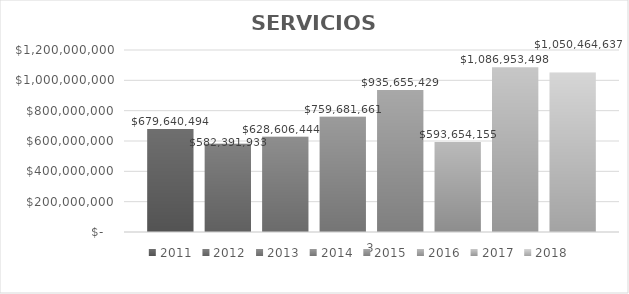
| Category | 2011 | 2012 | 2013 | 2014 | 2015 | 2016 | 2017 | 2018 |
|---|---|---|---|---|---|---|---|---|
| 0 | 679640494 | 582391933 | 628606444 | 759681661.469 | 935655429 | 593654154.91 | 1086953498.37 | 1050464637.49 |